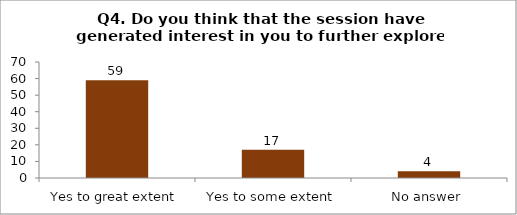
| Category | Q4. Do you think that the session have generated interest in you to further explore the topics? |
|---|---|
| Yes to great extent | 59 |
| Yes to some extent | 17 |
| No answer | 4 |